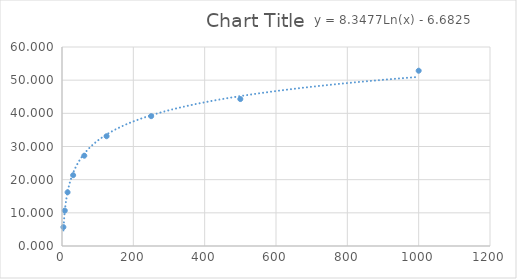
| Category | Series 0 |
|---|---|
| 3.91 | 5.694 |
| 7.81 | 10.676 |
| 15.62 | 16.192 |
| 31.25 | 21.352 |
| 62.5 | 27.224 |
| 125.0 | 33.096 |
| 250.0 | 39.146 |
| 500.0 | 44.306 |
| 1000.0 | 52.847 |